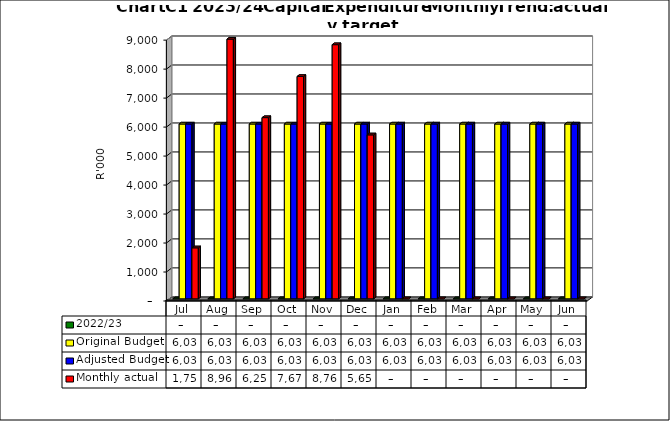
| Category | 2022/23 | Original Budget | Adjusted Budget | Monthly actual |
|---|---|---|---|---|
| Jul | 0 | 6031706 | 6031706 | 1759374.9 |
| Aug | 0 | 6031706 | 6031706 | 8961182.31 |
| Sep | 0 | 6031706 | 6031706 | 6251636.02 |
| Oct | 0 | 6031706 | 6031706 | 7671938.68 |
| Nov | 0 | 6031706 | 6031706 | 8768380.14 |
| Dec | 0 | 6031706 | 6031706 | 5656425.03 |
| Jan | 0 | 6031706 | 6031706 | 0 |
| Feb | 0 | 6031706 | 6031706 | 0 |
| Mar | 0 | 6031706 | 6031706 | 0 |
| Apr | 0 | 6031706 | 6031706 | 0 |
| May | 0 | 6031706 | 6031706 | 0 |
| Jun | 0 | 6031584 | 6031584 | 0 |